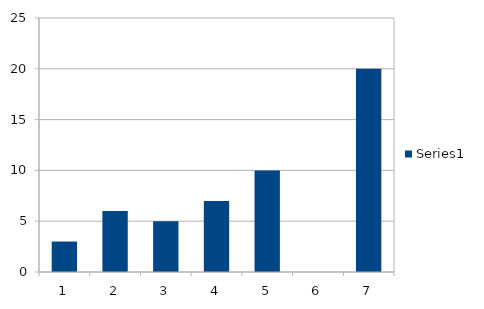
| Category | Series 0 |
|---|---|
| 0 | 3 |
| 1 | 6 |
| 2 | 5 |
| 3 | 7 |
| 4 | 10 |
| 5 | 0 |
| 6 | 20 |